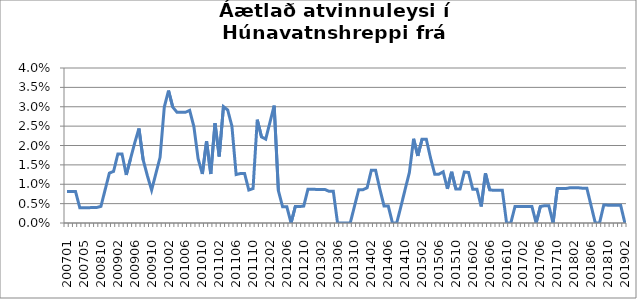
| Category | Series 0 |
|---|---|
| 200701 | 0.008 |
| 200702 | 0.008 |
| 200703 | 0.008 |
| 200704 | 0.004 |
| 200705 | 0.004 |
| 200706 | 0.004 |
| 200707 | 0.004 |
| 200708 | 0.004 |
| 200810 | 0.004 |
| 200811 | 0.009 |
| 200812 | 0.013 |
| 200901 | 0.013 |
| 200902 | 0.018 |
| 200903 | 0.018 |
| 200904 | 0.012 |
| 200905 | 0.017 |
| 200906 | 0.021 |
| 200907 | 0.024 |
| 200908 | 0.016 |
| 200909 | 0.012 |
| 200910 | 0.008 |
| 200911 | 0.013 |
| 200912 | 0.017 |
| 201001 | 0.03 |
| 201002 | 0.034 |
| 201003 | 0.03 |
| 201004 | 0.029 |
| 201005 | 0.029 |
| 201006 | 0.029 |
| 201007 | 0.029 |
| 201008 | 0.025 |
| 201009 | 0.017 |
| 201010 | 0.013 |
| 201011 | 0.021 |
| 201012 | 0.013 |
| 201101 | 0.026 |
| 201102 | 0.017 |
| 201103 | 0.03 |
| 201104 | 0.029 |
| 201105 | 0.025 |
| 201106 | 0.012 |
| 201107 | 0.013 |
| 201108 | 0.013 |
| 201109 | 0.009 |
| 201110 | 0.009 |
| 201111 | 0.027 |
| 201112 | 0.022 |
| 201201 | 0.022 |
| 201202 | 0.026 |
| 201203 | 0.03 |
| 201204 | 0.008 |
| 201205 | 0.004 |
| 201206 | 0.004 |
| 201207 | 0 |
| 201208 | 0.004 |
| 201209 | 0.004 |
| 201210 | 0.004 |
| 201211 | 0.009 |
| 201212 | 0.009 |
| 201301 | 0.009 |
| 201302 | 0.009 |
| 201303 | 0.009 |
| 201304 | 0.008 |
| 201305 | 0.008 |
| 201306 | 0 |
| 201307 | 0 |
| 201308 | 0 |
| 201309 | 0 |
| 201310 | 0.004 |
| 201311 | 0.009 |
| 201312 | 0.009 |
| 201401 | 0.009 |
| 201402 | 0.014 |
| 201403 | 0.014 |
| 201404 | 0.009 |
| 201405 | 0.004 |
| 201406 | 0.004 |
| 201407 | 0 |
| 201408 | 0 |
| 201409 | 0.004 |
| 201410 | 0.009 |
| 201411 | 0.013 |
| 201412 | 0.022 |
| 201501 | 0.017 |
| 201502 | 0.022 |
| 201503 | 0.022 |
| 201504 | 0.017 |
| 201505 | 0.013 |
| 201506 | 0.013 |
| 201507 | 0.013 |
| 201508 | 0.009 |
| 201509 | 0.013 |
| 201510 | 0.009 |
| 201511 | 0.009 |
| 201512 | 0.013 |
| 201601 | 0.013 |
| 201602 | 0.009 |
| 201603 | 0.009 |
| 201604 | 0.004 |
| 201605 | 0.013 |
| 201606 | 0.009 |
| 201607 | 0.008 |
| 201608 | 0.008 |
| 201609 | 0.008 |
| 201610 | 0 |
| 201611 | 0 |
| 201612 | 0.004 |
| 201701 | 0.004 |
| 201702 | 0.004 |
| 201703 | 0.004 |
| 201704 | 0.004 |
| 201705 | 0 |
| 201706 | 0.004 |
| 201707 | 0.004 |
| 201708 | 0.004 |
| 201709 | 0 |
| 201710 | 0.009 |
| 201711 | 0.009 |
| 201712 | 0.009 |
| 201801 | 0.009 |
| 201802 | 0.009 |
| 201803 | 0.009 |
| 201804 | 0.009 |
| 201805 | 0.009 |
| 201806 | 0.004 |
| 201807 | 0 |
| 201808 | 0 |
| 201809 | 0.005 |
| 201810 | 0.005 |
| 201811 | 0.005 |
| 201812 | 0.005 |
| 201901 | 0.005 |
| 201902 | 0 |